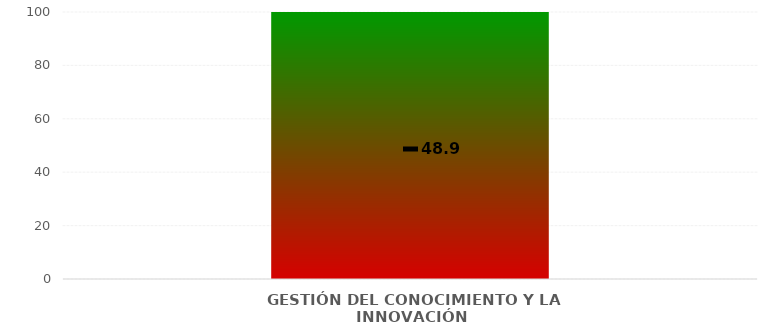
| Category | Niveles |
|---|---|
| GESTIÓN DEL CONOCIMIENTO Y LA INNOVACIÓN | 100 |